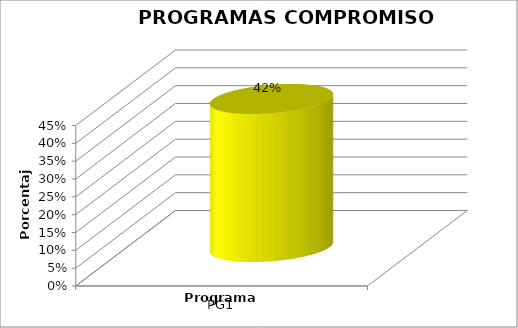
| Category | Series 0 |
|---|---|
| PG1 | 0.415 |